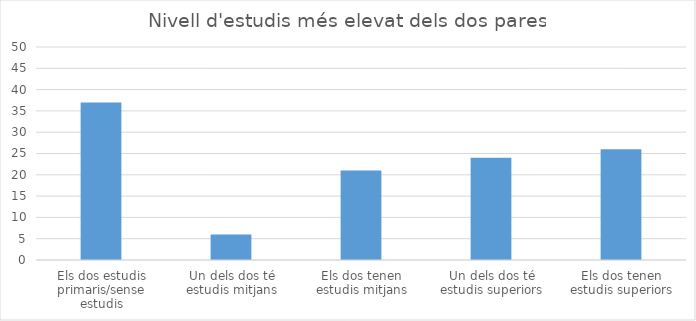
| Category | Series 0 |
|---|---|
| Els dos estudis primaris/sense estudis | 37 |
| Un dels dos té estudis mitjans | 6 |
| Els dos tenen estudis mitjans | 21 |
| Un dels dos té estudis superiors | 24 |
| Els dos tenen estudis superiors | 26 |